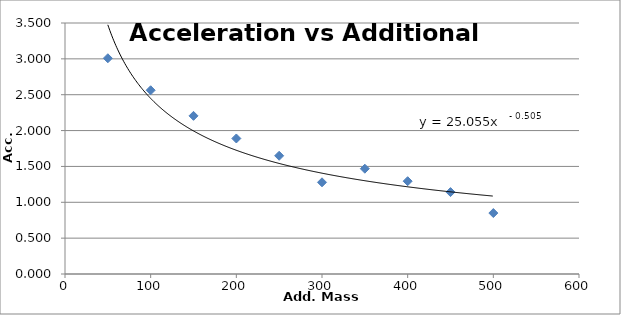
| Category | Series 0 |
|---|---|
| 50.0 | 3.008 |
| 100.0 | 2.562 |
| 150.0 | 2.205 |
| 200.0 | 1.89 |
| 250.0 | 1.649 |
| 300.0 | 1.279 |
| 350.0 | 1.468 |
| 400.0 | 1.294 |
| 450.0 | 1.142 |
| 500.0 | 0.85 |